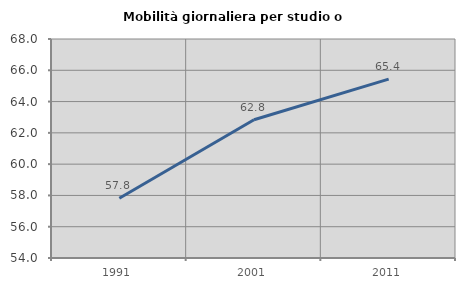
| Category | Mobilità giornaliera per studio o lavoro |
|---|---|
| 1991.0 | 57.818 |
| 2001.0 | 62.837 |
| 2011.0 | 65.438 |